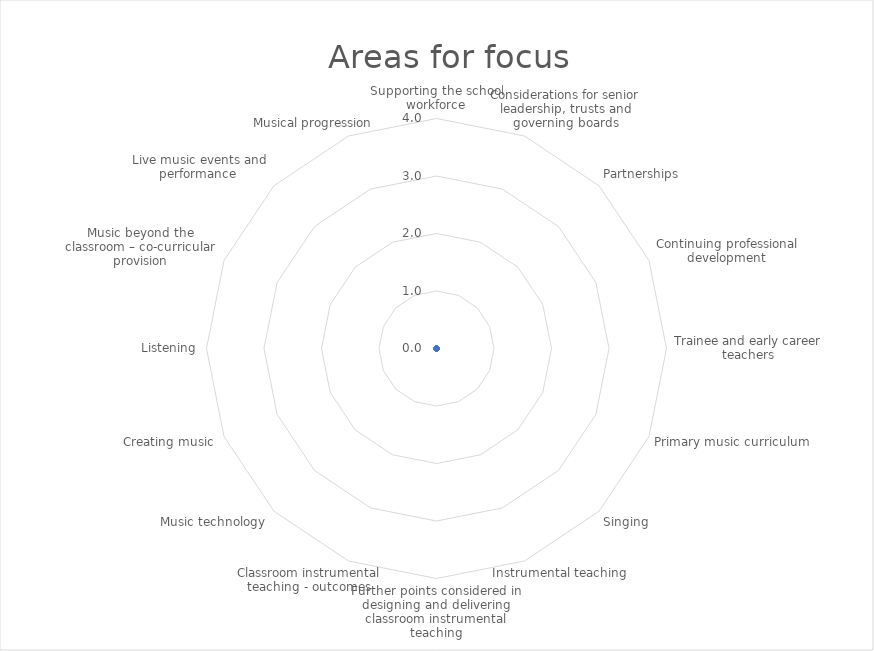
| Category | Series 0 |
|---|---|
| Supporting the school workforce | 0 |
| Considerations for senior leadership, trusts and governing boards | 0 |
| Partnerships | 0 |
| Continuing professional development | 0 |
| Trainee and early career teachers | 0 |
| Primary music curriculum | 0 |
| Singing | 0 |
| Instrumental teaching | 0 |
| Further points considered in designing and delivering classroom instrumental teaching | 0 |
| Classroom instrumental teaching - outcomes | 0 |
| Music technology | 0 |
| Creating music | 0 |
| Listening | 0 |
| Music beyond the classroom – co-curricular provision | 0 |
| Live music events and performance  | 0 |
| Musical progression | 0 |